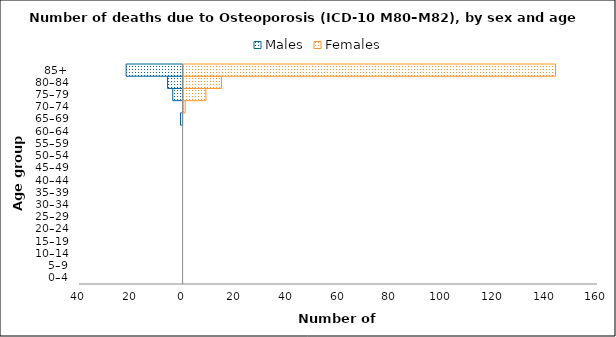
| Category | Males | Females |
|---|---|---|
| 0–4 | 0 | 0 |
| 5–9 | 0 | 0 |
| 10–14 | 0 | 0 |
| 15–19 | 0 | 0 |
| 20–24 | 0 | 0 |
| 25–29 | 0 | 0 |
| 30–34 | 0 | 0 |
| 35–39 | 0 | 0 |
| 40–44 | 0 | 0 |
| 45–49 | 0 | 0 |
| 50–54 | 0 | 0 |
| 55–59 | 0 | 0 |
| 60–64 | 0 | 0 |
| 65–69 | -1 | 0 |
| 70–74 | 0 | 1 |
| 75–79 | -4 | 9 |
| 80–84 | -6 | 15 |
| 85+ | -22 | 144 |